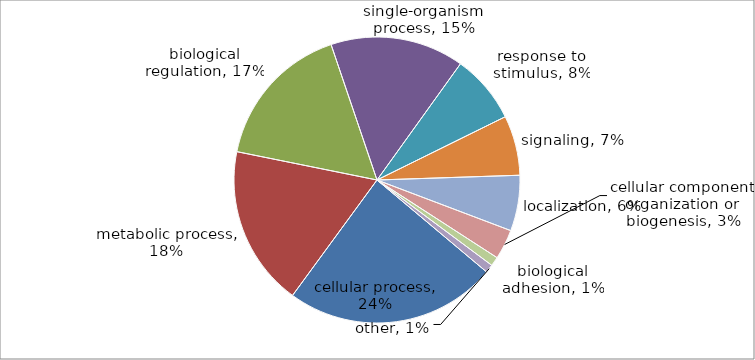
| Category | Series 0 |
|---|---|
| cellular process | 255 |
| metabolic process | 193 |
| biological regulation | 177 |
| single-organism process | 161 |
| response to stimulus | 83 |
| signaling | 72 |
| localization | 67 |
| cellular component organization or biogenesis | 36 |
| biological adhesion | 11 |
| other | 10 |